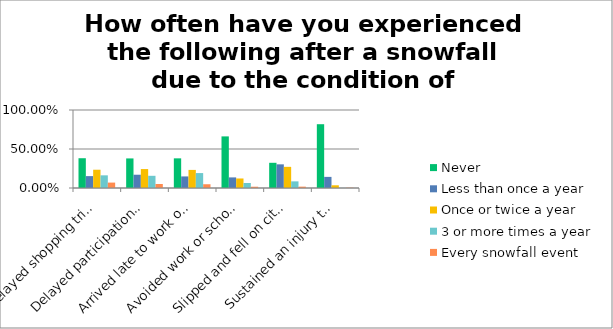
| Category | Never | Less than once a year | Once or twice a year | 3 or more times a year | Every snowfall event |
|---|---|---|---|---|---|
| Delayed shopping trips | 0.382 | 0.152 | 0.234 | 0.162 | 0.069 |
| Delayed participation in social groups | 0.379 | 0.17 | 0.243 | 0.156 | 0.051 |
| Arrived late to work or school | 0.38 | 0.148 | 0.232 | 0.191 | 0.048 |
| Avoided work or school altogether even though it was open | 0.662 | 0.136 | 0.122 | 0.064 | 0.016 |
| Slipped and fell on city walkways | 0.323 | 0.303 | 0.271 | 0.085 | 0.017 |
| Sustained an injury that required medical attention | 0.818 | 0.142 | 0.035 | 0.001 | 0.004 |